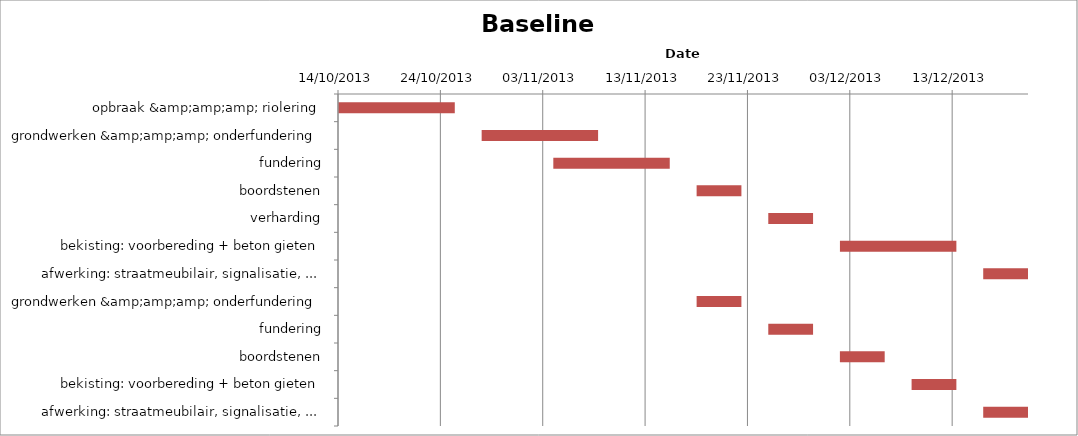
| Category | Baseline start | Actual duration |
|---|---|---|
| opbraak &amp;amp;amp; riolering | 41561.333 | 11.375 |
| grondwerken &amp;amp;amp; onderfundering | 41575.333 | 11.375 |
| fundering | 41582.333 | 11.375 |
| boordstenen | 41596.333 | 4.375 |
| verharding | 41603.333 | 4.375 |
| bekisting: voorbereding + beton gieten | 41610.333 | 11.375 |
| afwerking: straatmeubilair, signalisatie, ... | 41624.333 | 4.375 |
| grondwerken &amp;amp;amp; onderfundering | 41596.333 | 4.375 |
| fundering | 41603.333 | 4.375 |
| boordstenen | 41610.333 | 4.375 |
| bekisting: voorbereding + beton gieten | 41617.333 | 4.375 |
| afwerking: straatmeubilair, signalisatie, ... | 41624.333 | 4.375 |